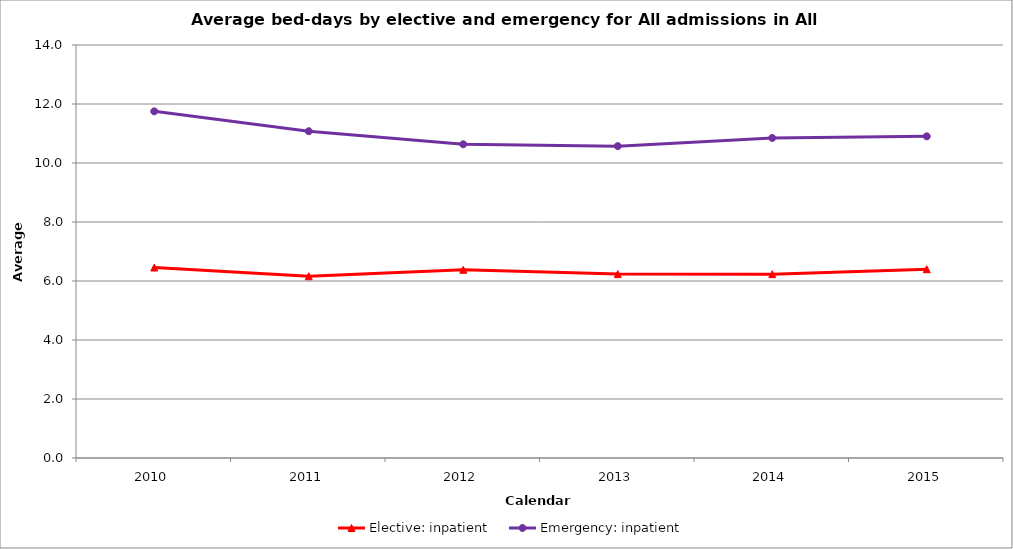
| Category | Elective: inpatient | Emergency: inpatient |
|---|---|---|
| 2010.0 | 6.457 | 11.751 |
| 2011.0 | 6.162 | 11.077 |
| 2012.0 | 6.379 | 10.635 |
| 2013.0 | 6.234 | 10.572 |
| 2014.0 | 6.232 | 10.848 |
| 2015.0 | 6.399 | 10.903 |